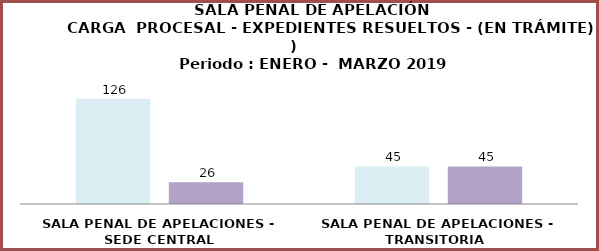
| Category | Series 0 | Series 1 |
|---|---|---|
| SALA PENAL DE APELACIONES - SEDE CENTRAL | 126 | 26 |
| SALA PENAL DE APELACIONES - TRANSITORIA  | 45 | 45 |